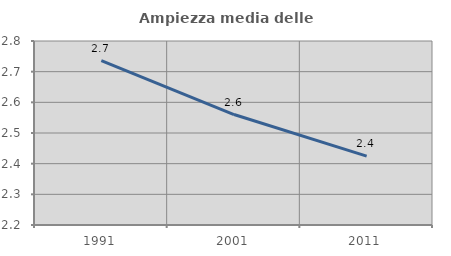
| Category | Ampiezza media delle famiglie |
|---|---|
| 1991.0 | 2.736 |
| 2001.0 | 2.56 |
| 2011.0 | 2.424 |